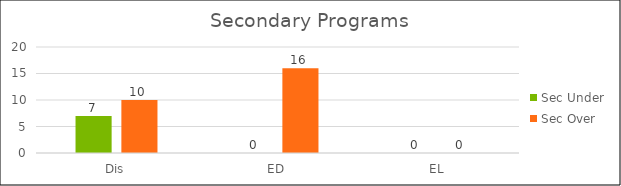
| Category | Sec Under | Sec Over |
|---|---|---|
| Dis | 7 | 10 |
| ED | 0 | 16 |
| EL | 0 | 0 |